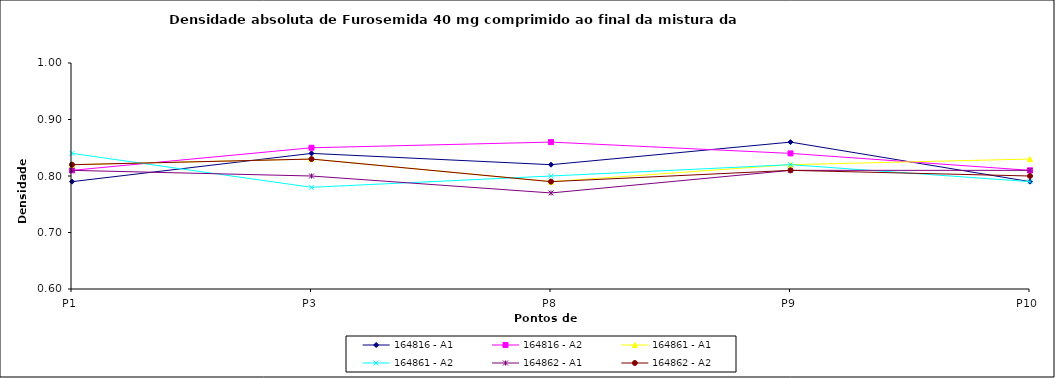
| Category | 164816 - A1 | 164816 - A2 | 164861 - A1 | 164861 - A2 | 164862 - A1 | 164862 - A2 |
|---|---|---|---|---|---|---|
| P1 | 0.79 | 0.81 | 0.82 | 0.84 | 0.81 | 0.82 |
| P3 | 0.84 | 0.85 | 0.83 | 0.78 | 0.8 | 0.83 |
| P8 | 0.82 | 0.86 | 0.79 | 0.8 | 0.77 | 0.79 |
| P9 | 0.86 | 0.84 | 0.82 | 0.82 | 0.81 | 0.81 |
| P10 | 0.79 | 0.81 | 0.83 | 0.79 | 0.81 | 0.8 |